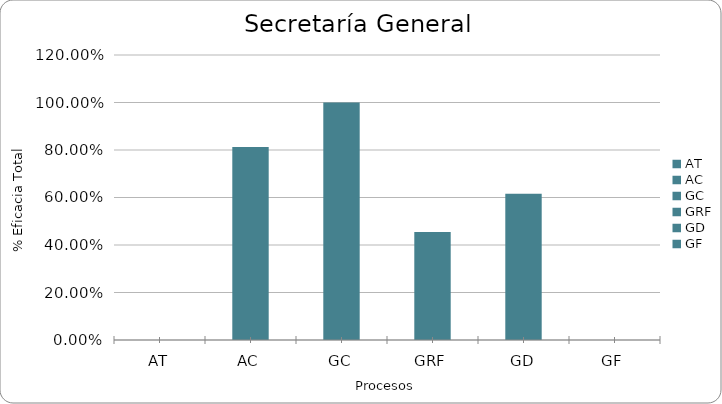
| Category | % Eficacia total |
|---|---|
| AT | 0 |
| AC | 0.812 |
| GC | 1 |
| GRF | 0.455 |
| GD | 0.615 |
| GF | 0 |